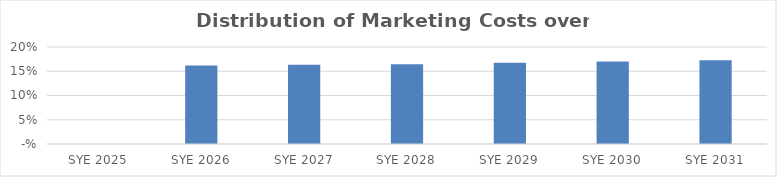
| Category | Series 0 |
|---|---|
| 2025.0 | 0 |
| 2026.0 | 0.162 |
| 2027.0 | 0.163 |
| 2028.0 | 0.165 |
| 2029.0 | 0.167 |
| 2030.0 | 0.17 |
| 2031.0 | 0.173 |